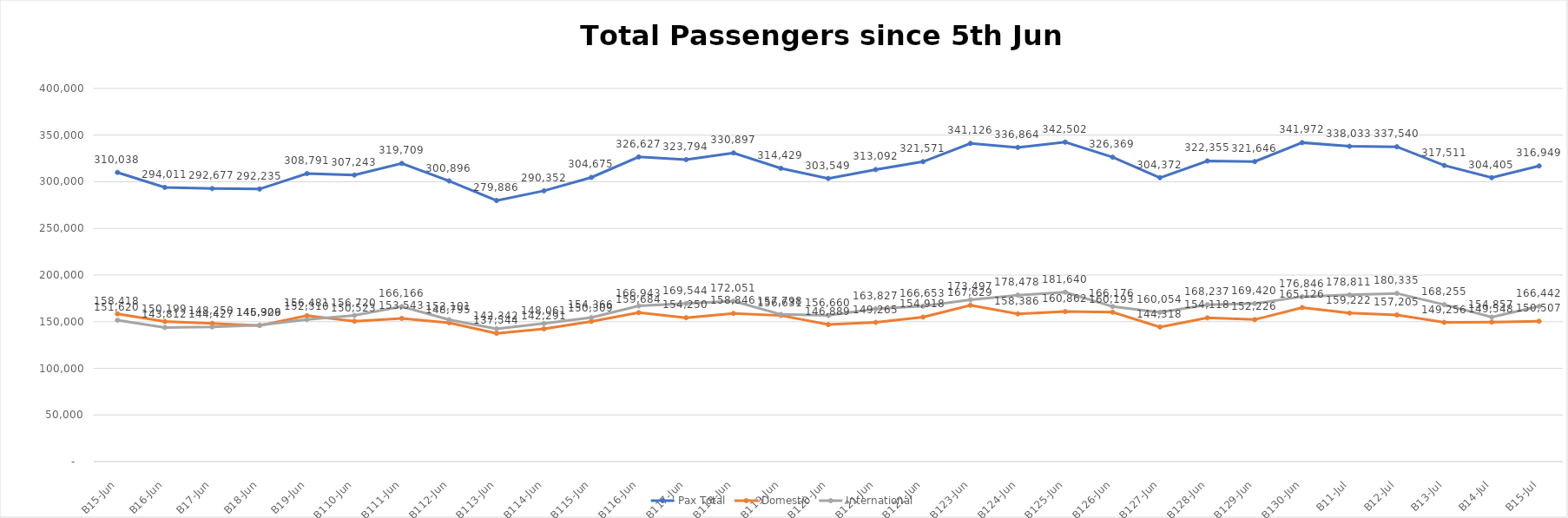
| Category | Pax Total |  Domestic  |  International  |
|---|---|---|---|
| 2023-06-05 | 310038 | 158418 | 151620 |
| 2023-06-06 | 294011 | 150199 | 143812 |
| 2023-06-07 | 292677 | 148250 | 144427 |
| 2023-06-08 | 292235 | 145926 | 146309 |
| 2023-06-09 | 308791 | 156481 | 152310 |
| 2023-06-10 | 307243 | 150523 | 156720 |
| 2023-06-11 | 319709 | 153543 | 166166 |
| 2023-06-12 | 300896 | 148795 | 152101 |
| 2023-06-13 | 279886 | 137544 | 142342 |
| 2023-06-14 | 290352 | 142291 | 148061 |
| 2023-06-15 | 304675 | 150309 | 154366 |
| 2023-06-16 | 326627 | 159684 | 166943 |
| 2023-06-17 | 323794 | 154250 | 169544 |
| 2023-06-18 | 330897 | 158846 | 172051 |
| 2023-06-19 | 314429 | 156631 | 157798 |
| 2023-06-20 | 303549 | 146889 | 156660 |
| 2023-06-21 | 313092 | 149265 | 163827 |
| 2023-06-22 | 321571 | 154918 | 166653 |
| 2023-06-23 | 341126 | 167629 | 173497 |
| 2023-06-24 | 336864 | 158386 | 178478 |
| 2023-06-25 | 342502 | 160862 | 181640 |
| 2023-06-26 | 326369 | 160193 | 166176 |
| 2023-06-27 | 304372 | 144318 | 160054 |
| 2023-06-28 | 322355 | 154118 | 168237 |
| 2023-06-29 | 321646 | 152226 | 169420 |
| 2023-06-30 | 341972 | 165126 | 176846 |
| 2023-07-01 | 338033 | 159222 | 178811 |
| 2023-07-02 | 337540 | 157205 | 180335 |
| 2023-07-03 | 317511 | 149256 | 168255 |
| 2023-07-04 | 304405 | 149548 | 154857 |
| 2023-07-05 | 316949 | 150507 | 166442 |